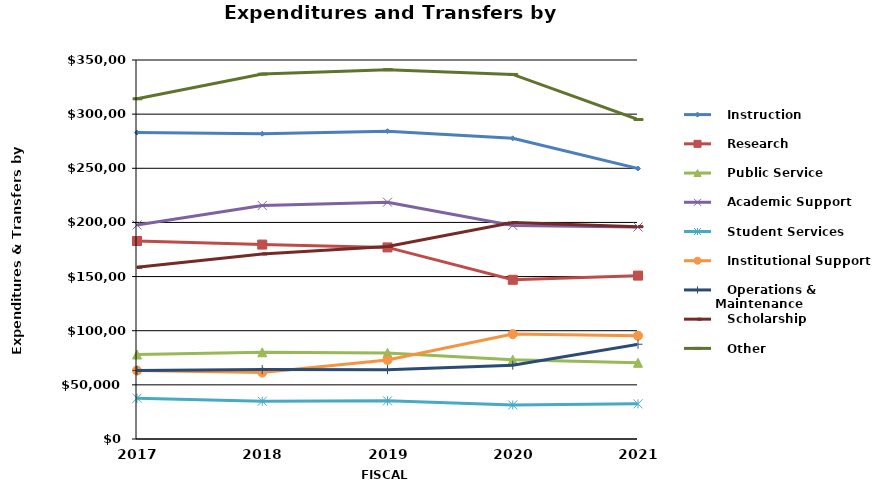
| Category |    Instruction |    Research |    Public Service |    Academic Support |    Student Services |    Institutional Support |    Operations & Maintenance |    Scholarship |    Other |
|---|---|---|---|---|---|---|---|---|---|
| 2017.0 | 282943 | 182846 | 78027 | 197661 | 37622 | 63217 | 63317 | 158591 | 314169 |
| 2018.0 | 281901 | 179547 | 80056 | 215610 | 34883 | 61388 | 64103 | 170941 | 336973 |
| 2019.0 | 284225 | 176924 | 79518 | 218697 | 35240 | 72961 | 64031 | 177815 | 341098 |
| 2020.0 | 277672 | 147031 | 73248 | 197224 | 31438 | 96854 | 68164 | 199854 | 336679 |
| 2021.0 | 249774 | 150892 | 70392 | 195785 | 32456 | 95426 | 87511 | 196059 | 295024 |